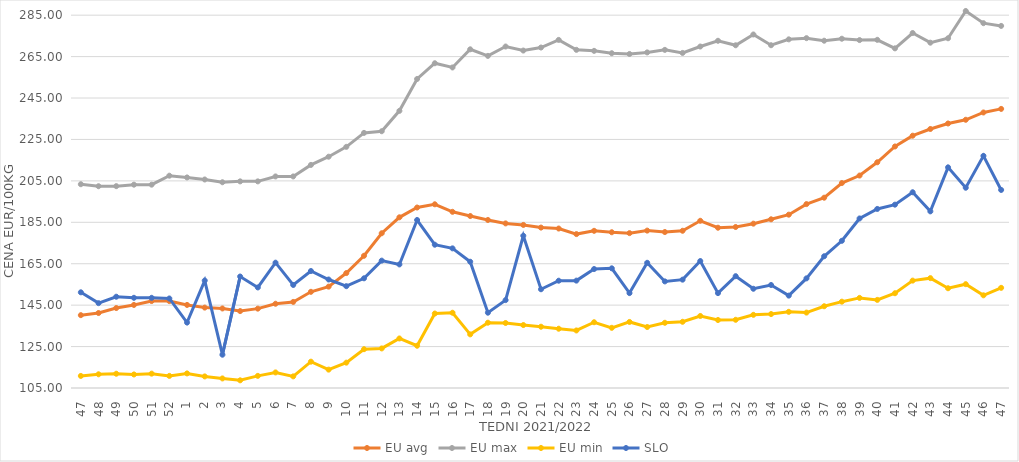
| Category | EU avg | EU max | EU min | SLO |
|---|---|---|---|---|
| 47.0 | 140.17 | 203.387 | 110.83 | 151.2 |
| 48.0 | 141.2 | 202.42 | 111.62 | 145.97 |
| 49.0 | 143.614 | 202.45 | 111.89 | 149.07 |
| 50.0 | 145.101 | 203.17 | 111.54 | 148.55 |
| 51.0 | 146.984 | 203.17 | 111.93 | 148.54 |
| 52.0 | 146.958 | 207.5 | 110.85 | 148.22 |
| 1.0 | 145.11 | 206.66 | 112.04 | 136.59 |
| 2.0 | 143.822 | 205.67 | 110.59 | 156.88 |
| 3.0 | 143.402 | 204.34 | 109.62 | 121.07 |
| 4.0 | 142.134 | 204.76 | 108.71 | 158.82 |
| 5.0 | 143.314 | 204.76 | 110.86 | 153.55 |
| 6.0 | 145.677 | 207.14 | 112.52 | 165.51 |
| 7.0 | 146.556 | 207.14 | 110.619 | 154.74 |
| 8.0 | 151.439 | 212.7 | 117.709 | 161.48 |
| 9.0 | 153.947 | 216.67 | 113.871 | 157.38 |
| 10.0 | 160.496 | 221.43 | 117.233 | 154.16 |
| 11.0 | 168.845 | 228.17 | 123.737 | 157.96 |
| 12.0 | 179.714 | 228.97 | 124.105 | 166.49 |
| 13.0 | 187.409 | 238.81 | 128.918 | 164.66 |
| 14.0 | 192.137 | 254.21 | 125.399 | 186.11 |
| 15.0 | 193.697 | 261.79 | 140.954 | 174.18 |
| 16.0 | 190.066 | 259.76 | 141.337 | 172.42 |
| 17.0 | 188.031 | 268.52 | 130.897 | 165.96 |
| 18.0 | 186.119 | 265.34 | 136.529 | 141.36 |
| 19.0 | 184.47 | 269.87 | 136.387 | 147.43 |
| 20.0 | 183.734 | 267.92 | 135.392 | 178.51 |
| 21.0 | 182.45 | 269.38 | 134.589 | 152.67 |
| 22.0 | 181.991 | 273.06 | 133.621 | 156.8 |
| 23.0 | 179.308 | 268.27 | 132.787 | 156.84 |
| 24.0 | 180.886 | 267.77 | 136.75 | 162.44 |
| 25.0 | 180.2 | 266.63 | 134.058 | 162.78 |
| 26.0 | 179.77 | 266.27 | 136.895 | 150.82 |
| 27.0 | 180.992 | 267.02 | 134.44 | 165.45 |
| 28.0 | 180.305 | 268.25 | 136.486 | 156.46 |
| 29.0 | 180.913 | 266.77 | 136.97 | 157.31 |
| 30.0 | 185.728 | 269.87 | 139.777 | 166.29 |
| 31.0 | 182.385 | 272.64 | 137.828 | 150.81 |
| 32.0 | 182.73 | 270.47 | 137.934 | 158.99 |
| 33.0 | 184.343 | 275.68 | 140.33 | 152.91 |
| 34.0 | 186.448 | 270.49 | 140.7 | 154.73 |
| 35.0 | 188.684 | 273.33 | 141.78 | 149.6 |
| 36.0 | 193.792 | 273.91 | 141.41 | 157.93 |
| 37.0 | 196.877 | 272.67 | 144.47 | 168.61 |
| 38.0 | 203.962 | 273.63 | 146.68 | 176.07 |
| 39.0 | 207.574 | 272.98 | 148.499 | 186.86 |
| 40.0 | 213.979 | 273.1 | 147.54 | 191.45 |
| 41.0 | 221.608 | 268.98 | 150.75 | 193.52 |
| 42.0 | 226.807 | 276.39 | 156.848 | 199.51 |
| 43.0 | 230.056 | 271.72 | 158.04 | 190.28 |
| 44.0 | 232.707 | 273.856 | 153.16 | 211.53 |
| 45.0 | 234.505 | 287.021 | 155.13 | 201.69 |
| 46.0 | 238.024 | 281.133 | 149.75 | 217.08 |
| 47.0 | 239.749 | 279.819 | 153.36 | 200.62 |